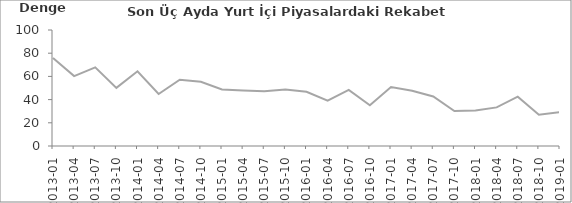
| Category | Son Üç Aydaki Yurt İçi Piyasalarda Rekabet Gücü |
|---|---|
| 2013-01 | 75.9 |
| 2013-04 | 60.3 |
| 2013-07 | 67.8 |
| 2013-10 | 50.1 |
| 2014-01 | 64.4 |
| 2014-04 | 44.8 |
| 2014-07 | 57.1 |
| 2014-10 | 55.4 |
| 2015-01 | 48.8 |
| 2015-04 | 47.8 |
| 2015-07 | 47.1 |
| 2015-10 | 48.8 |
| 2016-01 | 46.8 |
| 2016-04 | 39.1 |
| 2016-07 | 48.3 |
| 2016-10 | 35.1 |
| 2017-01 | 50.8 |
| 2017-04 | 47.7 |
| 2017-07 | 42.7 |
| 2017-10 | 30.2 |
| 2018-01 | 30.6 |
| 2018-04 | 33.3 |
| 2018-07 | 42.5 |
| 2018-10 | 27 |
| 2019-01 | 29.2 |